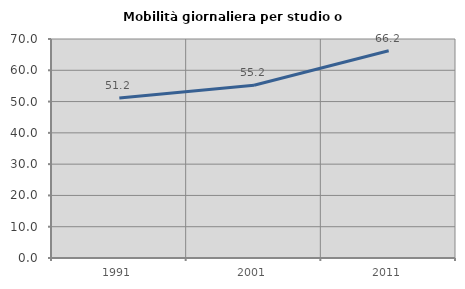
| Category | Mobilità giornaliera per studio o lavoro |
|---|---|
| 1991.0 | 51.172 |
| 2001.0 | 55.242 |
| 2011.0 | 66.221 |